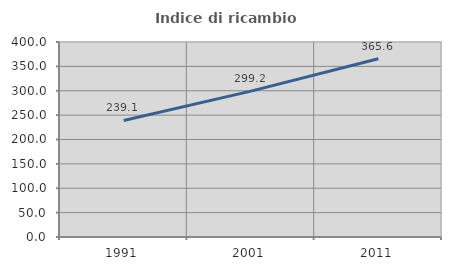
| Category | Indice di ricambio occupazionale  |
|---|---|
| 1991.0 | 239.098 |
| 2001.0 | 299.2 |
| 2011.0 | 365.649 |